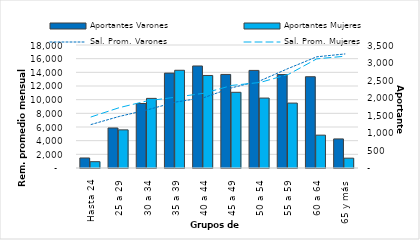
| Category | Aportantes Varones | Aportantes Mujeres |
|---|---|---|
| 0 | 285 | 180 |
| 1 | 1139 | 1085 |
| 2 | 1835 | 1981 |
| 3 | 2700 | 2781 |
| 4 | 2903 | 2633 |
| 5 | 2662 | 2154 |
| 6 | 2777 | 1990 |
| 7 | 2659 | 1847 |
| 8 | 2597 | 935 |
| 9 | 827 | 280 |